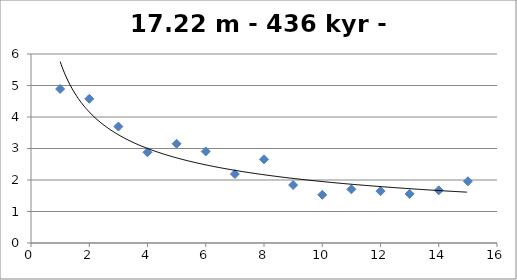
| Category | Series 0 |
|---|---|
| 1.0 | 4.89 |
| 2.0 | 4.578 |
| 3.0 | 3.697 |
| 4.0 | 2.88 |
| 5.0 | 3.15 |
| 6.0 | 2.906 |
| 7.0 | 2.188 |
| 8.0 | 2.658 |
| 9.0 | 1.84 |
| 10.0 | 1.53 |
| 11.0 | 1.705 |
| 12.0 | 1.646 |
| 13.0 | 1.559 |
| 14.0 | 1.671 |
| 15.0 | 1.96 |